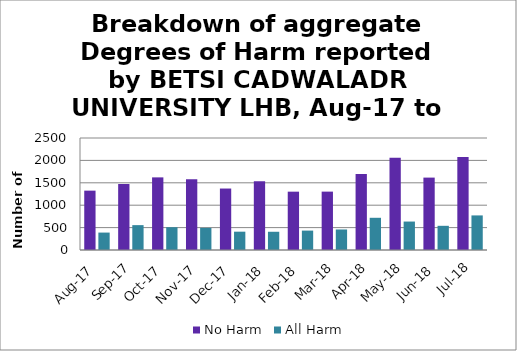
| Category | No Harm | All Harm |
|---|---|---|
| Aug-17 | 1325 | 389 |
| Sep-17 | 1473 | 555 |
| Oct-17 | 1621 | 509 |
| Nov-17 | 1581 | 494 |
| Dec-17 | 1372 | 409 |
| Jan-18 | 1537 | 407 |
| Feb-18 | 1302 | 433 |
| Mar-18 | 1303 | 458 |
| Apr-18 | 1697 | 719 |
| May-18 | 2061 | 635 |
| Jun-18 | 1616 | 540 |
| Jul-18 | 2075 | 772 |